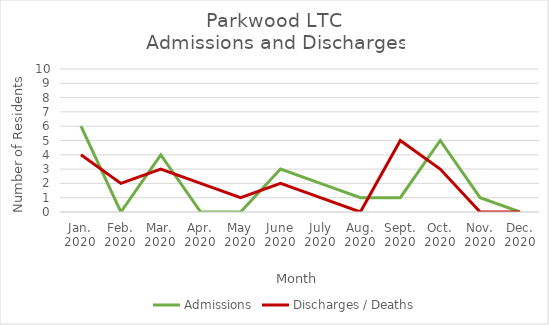
| Category | Admissions | Discharges / Deaths |
|---|---|---|
| Jan.
2020 | 6 | 4 |
| Feb.
2020 | 0 | 2 |
| Mar.
2020 | 4 | 3 |
| Apr.
2020 | 0 | 2 |
| May
2020 | 0 | 1 |
| June
2020 | 3 | 2 |
| July
2020 | 2 | 1 |
| Aug.
2020 | 1 | 0 |
| Sept.
2020 | 1 | 5 |
| Oct.
2020 | 5 | 3 |
| Nov.
2020 | 1 | 0 |
| Dec.
2020 | 0 | 0 |